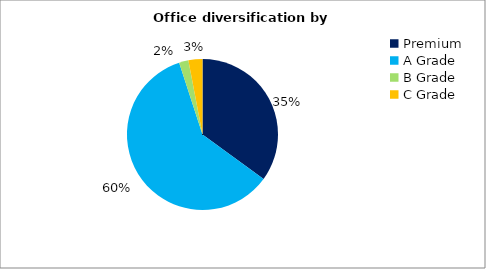
| Category | Series 0 |
|---|---|
| Premium | 0.35 |
| A Grade | 0.6 |
| B Grade | 0.02 |
| C Grade | 0.03 |